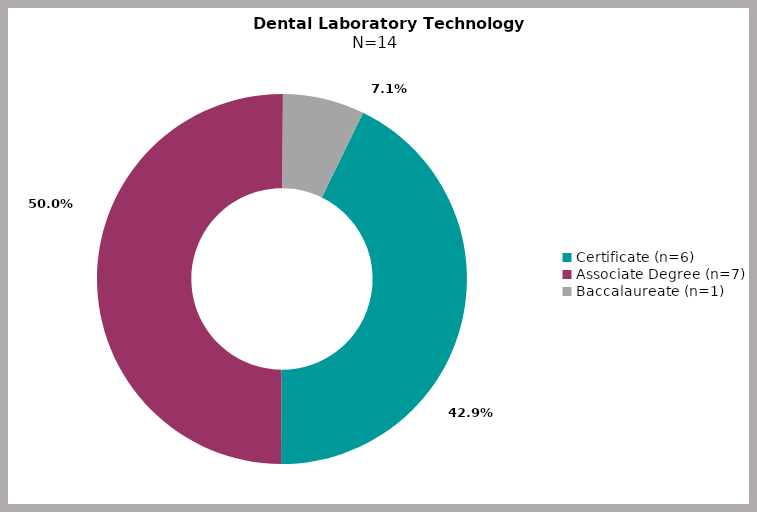
| Category | Series 0 |
|---|---|
| Certificate (n=6) | 0.429 |
| Associate Degree (n=7) | 0.5 |
| Baccalaureate (n=1) | 0.071 |